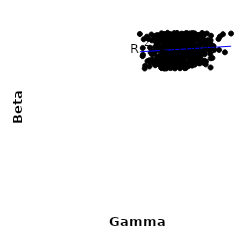
| Category | Series 0 |
|---|---|
| 69.50091099472762 | 36.958 |
| 64.76195551774569 | 36.734 |
| 52.61599306429363 | 40.559 |
| 70.52165849465416 | 40.18 |
| 66.70148227374929 | 40.958 |
| 60.17512605375697 | 36.178 |
| 63.05868329611551 | 38.92 |
| 69.7112657836907 | 43.843 |
| 56.74791062412148 | 37.828 |
| 62.64018640640481 | 41.712 |
| 62.4076777091893 | 40.652 |
| 61.206138520618694 | 43.094 |
| 64.09080310394624 | 42.838 |
| 58.86115325839018 | 40.185 |
| 67.63778254976891 | 39.768 |
| 58.26992391893475 | 39.957 |
| 62.54112199188573 | 41.96 |
| 55.28059198873451 | 42.384 |
| 68.75714102755667 | 40.41 |
| 59.076305241577266 | 41.929 |
| 57.23111447793356 | 40.575 |
| 71.03455433065072 | 40.783 |
| 62.600856330712084 | 43.222 |
| 57.26672347848252 | 35.931 |
| 66.9254650715199 | 38.447 |
| 53.039568420895606 | 43.501 |
| 60.274634588186956 | 41.806 |
| 60.23069764821688 | 36.607 |
| 60.18112853912866 | 36.248 |
| 60.922161307929194 | 40.743 |
| 76.26484020752335 | 39.625 |
| 66.30910836680529 | 39.402 |
| 58.00721651236583 | 41.864 |
| 70.13679444129949 | 37.595 |
| 65.98721710906308 | 39.716 |
| 59.21406231988178 | 36.385 |
| 71.3988687306455 | 40.146 |
| 67.41817342015584 | 35.902 |
| 57.233685607543016 | 41.161 |
| 69.2878588684987 | 37.248 |
| 60.21771374545117 | 37.664 |
| 62.99415790902303 | 41.364 |
| 71.37086996908496 | 40.7 |
| 57.17063782545434 | 38.226 |
| 61.937436230188524 | 41.711 |
| 59.686064288371426 | 42.204 |
| 70.84228764809791 | 37.382 |
| 63.61791543163333 | 37.848 |
| 63.222237600138044 | 43.501 |
| 72.49753793576865 | 37.355 |
| 65.5347842203842 | 39.546 |
| 57.507427400437415 | 43.194 |
| 56.34098943048083 | 38.073 |
| 59.07166223004286 | 43.726 |
| 51.238126960161765 | 42.263 |
| 52.982491198065595 | 42.853 |
| 57.04651442063208 | 42.087 |
| 64.42130714959855 | 42.696 |
| 74.01556735592595 | 37.079 |
| 61.15694388540712 | 42.322 |
| 65.06349279447181 | 37.799 |
| 73.02307123042458 | 39.445 |
| 57.1787627227264 | 43.625 |
| 55.53632941959542 | 35.166 |
| 51.886835896262525 | 36.621 |
| 63.56718378816237 | 38.688 |
| 68.48387335111445 | 43.401 |
| 67.28289763268793 | 38.643 |
| 68.23146030515073 | 37.128 |
| 59.926466114508095 | 36.441 |
| 67.37299463641489 | 41.361 |
| 57.30036290093752 | 37.964 |
| 67.87613182079596 | 38.256 |
| 61.29887036553006 | 35.099 |
| 60.69048338788342 | 39.577 |
| 60.39263111576683 | 36.977 |
| 65.43249872364885 | 39.095 |
| 69.70544868620676 | 44.036 |
| 52.398699250076405 | 42.847 |
| 56.79542558856949 | 41.893 |
| 50.43973375643995 | 40.391 |
| 69.28161279365062 | 43.418 |
| 57.37985278345908 | 43.343 |
| 56.29770311885407 | 41.257 |
| 58.145101834557195 | 42.203 |
| 56.26266241641944 | 37.561 |
| 76.22691691536374 | 40.163 |
| 56.54642187577068 | 43.051 |
| 60.11243662858948 | 39.31 |
| 64.17251918789745 | 42.754 |
| 47.22291988231383 | 38.213 |
| 68.15053554529159 | 43.28 |
| 65.88464447178015 | 43.11 |
| 76.80521917207211 | 37.688 |
| 58.14844185337998 | 43.86 |
| 73.68264152253269 | 43.889 |
| 60.318544101325095 | 36.077 |
| 64.29239414460692 | 43.271 |
| 61.824322095639936 | 41.328 |
| 64.69466938695037 | 39.186 |
| 52.25590752080931 | 38.938 |
| 62.596996113513285 | 40.554 |
| 48.13023951954797 | 35.085 |
| 67.32756793712086 | 41.066 |
| 64.68322972636611 | 42.581 |
| 61.066535389333595 | 39.507 |
| 69.26925099089655 | 38.429 |
| 64.75408511352536 | 39.7 |
| 60.61563006948027 | 40.707 |
| 51.48198382665087 | 37.423 |
| 63.19156058910006 | 43.338 |
| 66.7464429547181 | 39.265 |
| 77.5665643314623 | 37.765 |
| 64.85466874011674 | 41.273 |
| 69.00573820225488 | 42.966 |
| 57.834627900208794 | 39.434 |
| 50.69278305676477 | 36.683 |
| 65.35335944368941 | 42.035 |
| 57.10074744846673 | 38.406 |
| 53.30954703306251 | 40.583 |
| 59.71548597126473 | 36.384 |
| 71.71186175709391 | 36.424 |
| 56.56378051165731 | 43.862 |
| 61.11257528387714 | 37.254 |
| 66.64295212033073 | 39.104 |
| 70.0750253328988 | 38.317 |
| 64.79165841536769 | 40.164 |
| 74.65361604491117 | 36.124 |
| 57.54000730312532 | 38.934 |
| 59.36731094948259 | 37.173 |
| 63.19810926546527 | 40.662 |
| 65.38035793357088 | 42.687 |
| 55.57915526877703 | 39.742 |
| 73.81883661287358 | 36.516 |
| 63.171075117094176 | 41.784 |
| 71.71994652506196 | 39.104 |
| 60.57506898712451 | 41.738 |
| 64.07307080958964 | 39.191 |
| 66.68897949598718 | 42.187 |
| 66.99219950685575 | 41.559 |
| 66.52322645834933 | 44.06 |
| 61.3458828964705 | 42.443 |
| 63.483502743120624 | 37.905 |
| 68.68895333289115 | 37.037 |
| 64.42971439208331 | 41.297 |
| 59.51045112429658 | 36.64 |
| 66.10860885129902 | 44.093 |
| 60.339108582198946 | 41.966 |
| 53.46291826533245 | 38.119 |
| 55.291752881513574 | 35.288 |
| 59.310683093816124 | 42.562 |
| 54.879046962569525 | 35.916 |
| 51.055161022090296 | 43.74 |
| 64.42153882276874 | 40.7 |
| 58.974147119165444 | 37.195 |
| 62.409749872626065 | 42.969 |
| 68.94434250960785 | 41.32 |
| 47.69929736604951 | 42.535 |
| 67.66081145249171 | 41.208 |
| 70.35537521320411 | 39.92 |
| 49.33606562056135 | 36.95 |
| 67.8043589536183 | 37.168 |
| 61.93180367981155 | 39.888 |
| 67.3744874985111 | 40.788 |
| 58.71278528438598 | 43.834 |
| 50.21024760970649 | 35.608 |
| 59.55608696479775 | 35.468 |
| 78.0280393691595 | 40.792 |
| 53.772894030487436 | 43.606 |
| 83.01413366650921 | 39.213 |
| 74.25826842421871 | 38.721 |
| 64.92287823440994 | 37.291 |
| 64.36061876196356 | 39.943 |
| 58.2200754979025 | 42.529 |
| 70.49314611785132 | 37.155 |
| 68.90725763353632 | 41.425 |
| 55.68855322700942 | 37.154 |
| 60.32310068102428 | 37.477 |
| 65.39817542192193 | 41.778 |
| 61.37952828066802 | 40.632 |
| 63.487804449626246 | 35.132 |
| 62.855465301864356 | 38.811 |
| 47.37125413446966 | 38.578 |
| 67.91800820489179 | 43.326 |
| 66.1269259559803 | 41.063 |
| 61.073501356054976 | 42.847 |
| 55.98142038139123 | 38.534 |
| 60.83344034718464 | 36.975 |
| 67.6844843176955 | 44.015 |
| 64.71076347182938 | 40.018 |
| 59.39675635394303 | 38.929 |
| 54.29381114518056 | 36.168 |
| 56.47191913705381 | 40.145 |
| 52.211916637997085 | 39.257 |
| 57.55941929427462 | 43.312 |
| 56.85963928138579 | 37.46 |
| 57.874607179050535 | 36.747 |
| 66.0578051837437 | 36.099 |
| 69.39431896253204 | 41.161 |
| 71.923099103706 | 40.883 |
| 65.53448015166826 | 37.763 |
| 57.8216457537965 | 37.416 |
| 66.68749888763676 | 40.973 |
| 59.89619240060623 | 41.708 |
| 53.23553388820803 | 41.59 |
| 54.60443942441889 | 38.348 |
| 60.141376276325275 | 35.332 |
| 52.438767890613256 | 36.273 |
| 65.5125994291472 | 42.665 |
| 62.13985789418232 | 36.514 |
| 49.65802528727438 | 42.629 |
| 65.15596612080031 | 36.626 |
| 62.05580816790858 | 42.409 |
| 59.273385826312605 | 42.856 |
| 63.507591373446694 | 40.584 |
| 74.12870359999056 | 40.189 |
| 52.04536709035201 | 36.67 |
| 65.07274874608865 | 36.18 |
| 59.52648091620508 | 40.55 |
| 59.23643607805128 | 42.871 |
| 51.43146363530009 | 37.213 |
| 61.08119667385985 | 41.414 |
| 63.41324553597217 | 39.316 |
| 62.122692691265414 | 35.992 |
| 65.53730436470207 | 35.153 |
| 71.84013729396757 | 41.001 |
| 64.48070670558747 | 38.716 |
| 57.05007319789281 | 35.09 |
| 66.07383109449435 | 35.224 |
| 63.30655648202877 | 42.653 |
| 62.155009442719205 | 40.202 |
| 53.68459027764542 | 41.195 |
| 56.97117094294261 | 35.968 |
| 65.97691074258405 | 39.194 |
| 60.58901407252903 | 36.036 |
| 59.61454122694128 | 41.759 |
| 55.20519826113419 | 40.433 |
| 56.64713925623398 | 43.444 |
| 75.59743791041046 | 42.306 |
| 68.6465833165831 | 41.045 |
| 58.87263999113157 | 41.965 |
| 67.88506702991084 | 40.886 |
| 53.759264154746845 | 42.532 |
| 56.67558519155124 | 36.374 |
| 56.62483215994605 | 37.483 |
| 55.98022327486784 | 38.866 |
| 54.66401396281849 | 42.03 |
| 59.27948971986333 | 36.102 |
| 50.724334122068875 | 39.151 |
| 47.287090184288715 | 40.298 |
| 65.529518142136 | 41.504 |
| 61.01749158468499 | 36.135 |
| 55.490481395319925 | 39.285 |
| 57.91803027923841 | 40.805 |
| 73.91085575463653 | 39.043 |
| 62.79436996945401 | 37.95 |
| 55.86466241212812 | 42.8 |
| 67.58838662566744 | 39.993 |
| 71.57203638244023 | 43.624 |
| 65.07321096409527 | 42.408 |
| 77.03208697199908 | 41.212 |
| 72.00435654081942 | 40.934 |
| 58.29275869334839 | 43.146 |
| 61.22061455235402 | 41.163 |
| 54.449756294848456 | 40.776 |
| 61.802719666188786 | 37.2 |
| 62.19058042529273 | 40.479 |
| 65.15919128744089 | 36.868 |
| 64.3969691015535 | 43.879 |
| 67.87763755243732 | 39.409 |
| 64.14317383289558 | 43.961 |
| 59.80384873701511 | 37.109 |
| 54.618492025332316 | 43.282 |
| 67.31463923998903 | 35.735 |
| 70.56244571718632 | 43.271 |
| 58.67636334739559 | 37.788 |
| 64.57761082258777 | 38.899 |
| 71.49287507474098 | 40.19 |
| 66.972890267841 | 36.557 |
| 74.78363156082165 | 36.855 |
| 56.36158227788236 | 39.491 |
| 56.02482750719149 | 42.667 |
| 65.02091202069111 | 39.157 |
| 72.08029553342756 | 43.232 |
| 59.00489605621088 | 40.859 |
| 61.65407149844974 | 36.186 |
| 63.669834252575434 | 41.73 |
| 63.23060411318341 | 41.766 |
| 58.99996302169626 | 37.848 |
| 55.44366106960414 | 44.053 |
| 51.46283434319059 | 39.347 |
| 57.17371754556807 | 42.263 |
| 69.52395748962779 | 42.058 |
| 60.77015038423542 | 38.022 |
| 63.79882992353747 | 40.622 |
| 62.1055766322975 | 41.315 |
| 64.26370922855499 | 39.926 |
| 54.5125522006696 | 42.399 |
| 75.5312738321754 | 41.788 |
| 53.40608892909836 | 37.082 |
| 60.03447556619361 | 42.913 |
| 65.45239796751538 | 40.953 |
| 63.36601488060432 | 40.781 |
| 61.01426585284449 | 41.354 |
| 51.2877084538274 | 38.714 |
| 72.11118451759852 | 36.391 |
| 72.36457838257815 | 38.159 |
| 80.45335170423719 | 39.811 |
| 71.85479088856754 | 39.871 |
| 70.18984276189423 | 43.805 |
| 66.19011085184555 | 36.306 |
| 63.64039266147519 | 40.68 |
| 61.91367613098797 | 41.352 |
| 59.592879886019 | 39.86 |
| 52.593803456076486 | 42.233 |
| 52.959102063385025 | 42.842 |
| 65.23814417547827 | 39.37 |
| 67.81495765058514 | 36.002 |
| 82.15560650474538 | 43.821 |
| 57.312444696931976 | 41.816 |
| 53.76008291558832 | 39.755 |
| 67.20863070563199 | 36.251 |
| 62.69897230049927 | 39.456 |
| 60.426484025158096 | 41.464 |
| 58.459739050970306 | 39.22 |
| 64.52946127771338 | 37.365 |
| 52.73012429091031 | 35.898 |
| 71.44705737317362 | 36.642 |
| 66.63214065974805 | 40.362 |
| 66.51400339946215 | 41.868 |
| 64.49267633526367 | 41.559 |
| 76.95763163677503 | 43.438 |
| 46.02968649344053 | 43.878 |
| 62.132561745082356 | 41.034 |
| 59.258249839059886 | 35.182 |
| 59.49458722234259 | 43.807 |
| 60.991833455058895 | 35.585 |
| 78.36211645022209 | 39.877 |
| 75.14875420326642 | 44.009 |
| 61.41079332201177 | 36.019 |
| 59.452791588025626 | 35.663 |
| 59.18079446445457 | 38.609 |
| 57.20433580393498 | 39.281 |
| 71.09653962908571 | 37.925 |
| 49.07219451597056 | 43.193 |
| 69.29748524236133 | 38.281 |
| 76.65843586692827 | 38.837 |
| 59.93205317399498 | 36.837 |
| 63.97859315573747 | 40.077 |
| 55.80987522695267 | 42.898 |
| 60.064764037951356 | 42.318 |
| 60.95505519722186 | 38.242 |
| 60.92714296523135 | 44.11 |
| 58.029114360835244 | 37.733 |
| 72.96573040574525 | 42.798 |
| 67.91217432911925 | 41.543 |
| 57.70812104057701 | 40.587 |
| 61.87221026680151 | 39.767 |
| 61.79516858283596 | 36.099 |
| 59.47167259797546 | 41.087 |
| 63.497525703084435 | 43.695 |
| 69.99684112198649 | 40.996 |
| 61.23443441397606 | 36.163 |
| 55.95356822710642 | 43.699 |
| 66.93456418414513 | 38.921 |
| 69.08899476625382 | 37.664 |
| 57.376189426238604 | 35.692 |
| 63.05492777369826 | 36.165 |
| 56.26208317543733 | 43.323 |
| 65.9550923359681 | 41.947 |
| 63.527523386960034 | 43.144 |
| 74.71799987070013 | 41.135 |
| 66.05019090726574 | 42.142 |
| 60.486572487577625 | 38.527 |
| 76.4432834009237 | 41.409 |
| 59.450726487054204 | 39.993 |
| 62.35742836115452 | 38.267 |
| 67.85955877363088 | 40.554 |
| 69.82598069202335 | 36.72 |
| 57.88898966865394 | 35.73 |
| 68.60248116194168 | 42.322 |
| 62.91394537279946 | 41.144 |
| 62.688227647111404 | 38.573 |
| 68.74339940701041 | 35.813 |
| 58.0661581310663 | 44.188 |
| 62.255016577153 | 43.68 |
| 73.55593328188547 | 43.559 |
| 56.64064504513433 | 43.13 |
| 68.31909742318354 | 38.282 |
| 80.82457663786069 | 43.222 |
| 71.21497184065647 | 42.788 |
| 59.280022987946516 | 41.224 |
| 61.90758626637676 | 42.9 |
| 68.1748800259522 | 41.323 |
| 65.8659486638701 | 38.849 |
| 68.7364803793088 | 38.581 |
| 67.23101233940478 | 40.285 |
| 51.40198763234918 | 39.369 |
| 55.46818937103895 | 36.985 |
| 67.52440277596502 | 41.232 |
| 68.24776017704944 | 39.6 |
| 76.44409131102674 | 39.986 |
| 60.81761300053947 | 41.936 |
| 76.78588305180881 | 42.26 |
| 62.91610338812996 | 39.913 |
| 67.82044456833873 | 41.826 |
| 69.84839865967925 | 38.605 |
| 66.12254167688153 | 40.682 |
| 64.4296713399893 | 42.383 |
| 61.78856516435201 | 35.573 |
| 56.53157624980019 | 38.672 |
| 64.39080790648889 | 38.91 |
| 55.784659781700746 | 35.86 |
| 59.74818464712728 | 40.066 |
| 65.64574438172546 | 43.205 |
| 73.0793287036355 | 44.127 |
| 65.12974124445176 | 38.975 |
| 69.9026019479249 | 43.946 |
| 73.09524485809538 | 41.56 |
| 61.47783843951495 | 39.372 |
| 70.36122049940339 | 39.18 |
| 50.135341462217035 | 37.172 |
| 63.04028339270065 | 37.217 |
| 65.9149748279102 | 40.53 |
| 55.97530662971016 | 38.35 |
| 57.67182911609089 | 35.126 |
| 53.99520892023165 | 42.417 |
| 65.81650507844749 | 35.902 |
| 67.36762892566699 | 41.148 |
| 68.32652451210707 | 37.029 |
| 62.96610390562193 | 38.951 |
| 58.79291081116159 | 37.371 |
| 74.08862965602705 | 39.801 |
| 60.51529123029551 | 38.659 |
| 74.1841423402836 | 42.305 |
| 64.0622127606432 | 40.3 |
| 65.07632053418023 | 36.766 |
| 62.06624059862721 | 43.047 |
| 61.24490912643253 | 36.523 |
| 62.20154438688962 | 44.152 |
| 70.43146222438259 | 38.223 |
| 62.6548449889157 | 35.794 |
| 71.83754522682045 | 43.596 |
| 61.7865240632464 | 43.704 |
| 55.15616675104928 | 36.739 |
| 69.39047430967429 | 40.106 |
| 68.85622441808238 | 44.143 |
| 67.20257236406256 | 36.123 |
| 59.67459596566001 | 42.129 |
| 54.216199747692215 | 40.223 |
| 55.77718289763869 | 39.604 |
| 63.32482523318891 | 38.243 |
| 48.31979355824731 | 35.777 |
| 64.8016821378515 | 35.781 |
| 80.22191757429557 | 42.592 |
| 56.92444346146973 | 37.245 |
| 71.78537712045846 | 42.487 |
| 61.46832035833299 | 40.051 |
| 60.91330355967878 | 39.457 |
| 66.95384530319573 | 40.789 |
| 64.03239013780086 | 43.501 |
| 55.91647852729654 | 42.907 |
| 59.599740334737476 | 43.036 |
| 59.8875011384235 | 39.492 |
| 63.615120727006754 | 38.896 |
| 55.279306840827736 | 42.698 |
| 85.68823580620419 | 43.991 |
| 65.27202004797174 | 39.583 |
| 65.8675347041615 | 43.365 |
| 58.98802831356739 | 39.34 |
| 58.12952727141845 | 39.447 |
| 72.6946311017964 | 39.436 |
| 62.433179273089365 | 41.52 |
| 73.67252734112051 | 43.498 |
| 65.07777861505569 | 36.733 |
| 66.48702977084369 | 40.3 |
| 57.698034889495034 | 41.503 |
| 64.20643197387257 | 43.494 |
| 61.545054528233365 | 38.471 |
| 67.71803973408679 | 37.422 |
| 54.40832924949481 | 37.068 |
| 56.86113512113813 | 42.192 |
| 56.289791965505295 | 43.729 |
| 56.361258328585514 | 40.816 |
| 65.3552767337479 | 43.879 |
| 62.43944167238692 | 42.306 |
| 71.81684362731119 | 43.267 |
| 66.38934516329213 | 42.865 |
| 65.09263894055066 | 40.593 |
| 56.50293098877033 | 35.094 |
| 68.61008815566116 | 36.788 |
| 60.651815333565445 | 39.06 |
| 71.61767171691346 | 42.028 |
| 58.68011683337206 | 40.457 |
| 54.67754556165217 | 36.49 |
| 76.77640777331509 | 35.326 |
| 66.54251402257574 | 39.559 |
| 69.87049798301514 | 36.048 |
| 70.07855877483141 | 43.717 |
| 57.23412831354103 | 41.106 |